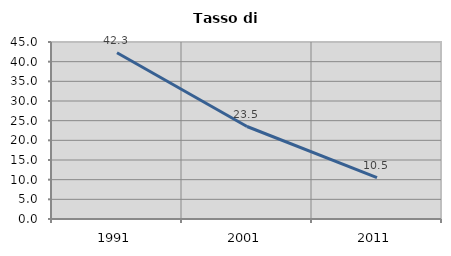
| Category | Tasso di disoccupazione   |
|---|---|
| 1991.0 | 42.267 |
| 2001.0 | 23.515 |
| 2011.0 | 10.526 |